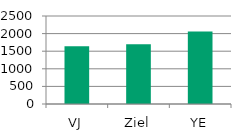
| Category | Series 0 |
|---|---|
| VJ | 1640 |
| Ziel | 1700 |
| YE | 2060 |